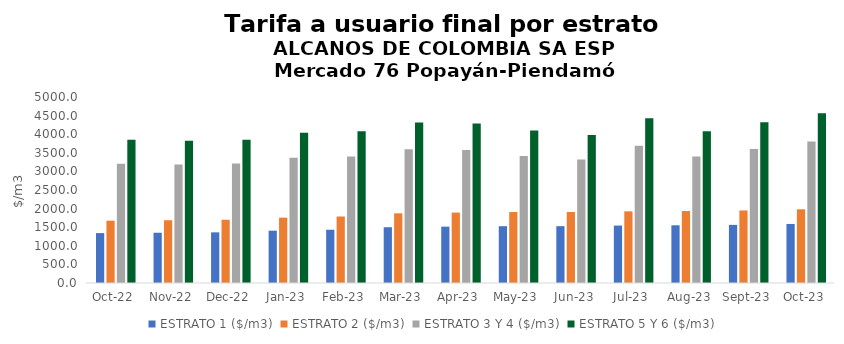
| Category | ESTRATO 1 ($/m3) | ESTRATO 2 ($/m3) | ESTRATO 3 Y 4 ($/m3) | ESTRATO 5 Y 6 ($/m3) |
|---|---|---|---|---|
| 2022-10-01 | 1341.42 | 1674.98 | 3208.12 | 3849.744 |
| 2022-11-01 | 1350.95 | 1687.14 | 3185.9 | 3823.08 |
| 2022-12-01 | 1361.48 | 1700.11 | 3209.93 | 3851.916 |
| 2023-01-01 | 1406.32 | 1756.53 | 3365.49 | 4038.588 |
| 2023-02-01 | 1431.45 | 1787.62 | 3398.26 | 4077.912 |
| 2023-03-01 | 1499.4 | 1873.1 | 3596.1 | 4315.32 |
| 2023-04-01 | 1515.22 | 1892.7 | 3575.22 | 4290.264 |
| 2023-05-01 | 1527.06 | 1907.55 | 3416.65 | 4099.98 |
| 2023-06-01 | 1528.08 | 1909 | 3316.57 | 3979.884 |
| 2023-07-01 | 1543.84 | 1926.61 | 3689.81 | 4427.772 |
| 2023-08-01 | 1551.43 | 1936.32 | 3401.48 | 4081.776 |
| 2023-09-01 | 1562.51 | 1949.77 | 3603.59 | 4324.308 |
| 2023-10-01 | 1587.1 | 1981.56 | 3805.44 | 4566.528 |